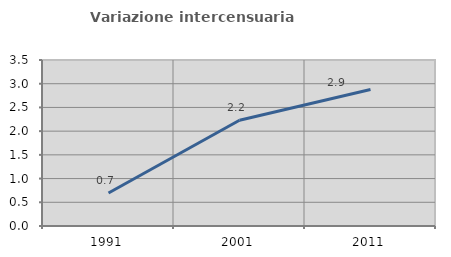
| Category | Variazione intercensuaria annua |
|---|---|
| 1991.0 | 0.697 |
| 2001.0 | 2.229 |
| 2011.0 | 2.876 |